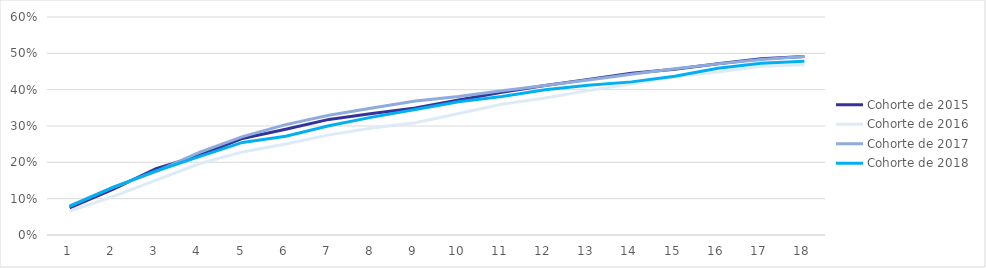
| Category | Cohorte de 2015 | Cohorte de 2016 | Cohorte de 2017 | Cohorte de 2018 |
|---|---|---|---|---|
| 0 | 0.075 | 0.066 | 0.08 | 0.079 |
| 1 | 0.125 | 0.106 | 0.131 | 0.131 |
| 2 | 0.182 | 0.151 | 0.175 | 0.176 |
| 3 | 0.219 | 0.196 | 0.228 | 0.216 |
| 4 | 0.266 | 0.229 | 0.271 | 0.255 |
| 5 | 0.291 | 0.25 | 0.304 | 0.272 |
| 6 | 0.318 | 0.276 | 0.329 | 0.301 |
| 7 | 0.334 | 0.294 | 0.349 | 0.324 |
| 8 | 0.35 | 0.309 | 0.369 | 0.346 |
| 9 | 0.371 | 0.334 | 0.381 | 0.367 |
| 10 | 0.393 | 0.36 | 0.397 | 0.381 |
| 11 | 0.412 | 0.377 | 0.412 | 0.4 |
| 12 | 0.428 | 0.397 | 0.427 | 0.412 |
| 13 | 0.445 | 0.416 | 0.442 | 0.421 |
| 14 | 0.456 | 0.436 | 0.457 | 0.437 |
| 15 | 0.471 | 0.449 | 0.471 | 0.459 |
| 16 | 0.485 | 0.464 | 0.483 | 0.473 |
| 17 | 0.491 | 0.469 | 0.492 | 0.478 |